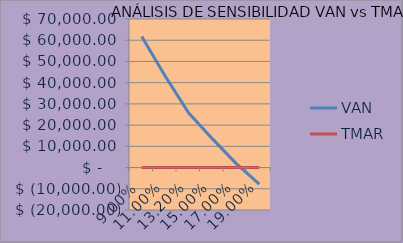
| Category | VAN | TMAR |
|---|---|---|
| 0.09 | 61734.01 | 0.09 |
| 0.11 | 42998.12 | 0.11 |
| 0.131961306 | 25697.6 | 0.132 |
| 0.15 | 13615.292 | 0.15 |
| 0.17 | 2090.083 | 0.17 |
| 0.19 | -7778.156 | 0.19 |